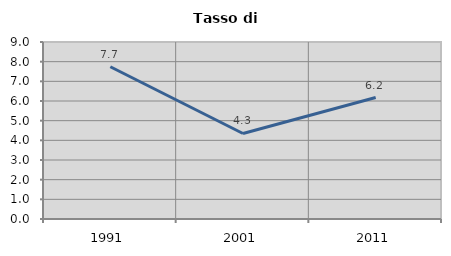
| Category | Tasso di disoccupazione   |
|---|---|
| 1991.0 | 7.741 |
| 2001.0 | 4.348 |
| 2011.0 | 6.176 |